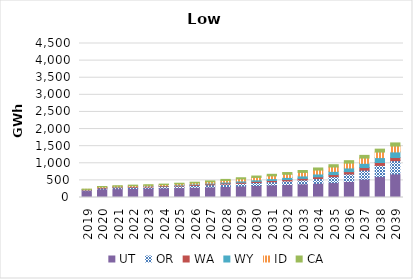
| Category | UT | OR | WA | WY | ID | CA |
|---|---|---|---|---|---|---|
| 2019.0 | 200.974 | 16.347 | 9.458 | 2.49 | 7.835 | 7.4 |
| 2020.0 | 250.676 | 23.105 | 15.743 | 4.628 | 15.142 | 11.533 |
| 2021.0 | 257.72 | 28.82 | 18.088 | 6.219 | 18.007 | 14.805 |
| 2022.0 | 263.994 | 33.465 | 19.484 | 7.27 | 20.267 | 16.788 |
| 2023.0 | 269.559 | 36.74 | 19.947 | 7.699 | 21.42 | 17.64 |
| 2024.0 | 277.26 | 41.422 | 20.653 | 9.326 | 23.528 | 19.051 |
| 2025.0 | 287.74 | 47.973 | 21.61 | 12.566 | 26.448 | 20.447 |
| 2026.0 | 298.145 | 55.183 | 23.472 | 17.406 | 30.307 | 22.913 |
| 2027.0 | 308.828 | 62.514 | 26.268 | 23.595 | 36.064 | 27.295 |
| 2028.0 | 321.869 | 70.328 | 28.879 | 29.97 | 45.695 | 31.998 |
| 2029.0 | 336.543 | 78.416 | 31.34 | 37.249 | 57.264 | 36.421 |
| 2030.0 | 350.957 | 86.569 | 33.857 | 45.479 | 69.192 | 41.43 |
| 2031.0 | 365.263 | 94.828 | 36.3 | 54.438 | 80.643 | 46.383 |
| 2032.0 | 381.094 | 103.28 | 39.893 | 63.115 | 90.743 | 51.175 |
| 2033.0 | 397.44 | 115.783 | 44.769 | 72.237 | 102.304 | 56.209 |
| 2034.0 | 415.511 | 138.012 | 51.344 | 82.146 | 114.393 | 61.244 |
| 2035.0 | 436.165 | 174.354 | 59.366 | 94.207 | 127.311 | 66.362 |
| 2036.0 | 468.75 | 219.275 | 67.629 | 107.662 | 140.89 | 72.069 |
| 2037.0 | 534.27 | 265.183 | 76.048 | 123.176 | 153.625 | 78.739 |
| 2038.0 | 611.548 | 326.69 | 83.664 | 143.404 | 162.462 | 85.282 |
| 2039.0 | 688.827 | 388.197 | 91.279 | 163.638 | 171.299 | 91.826 |